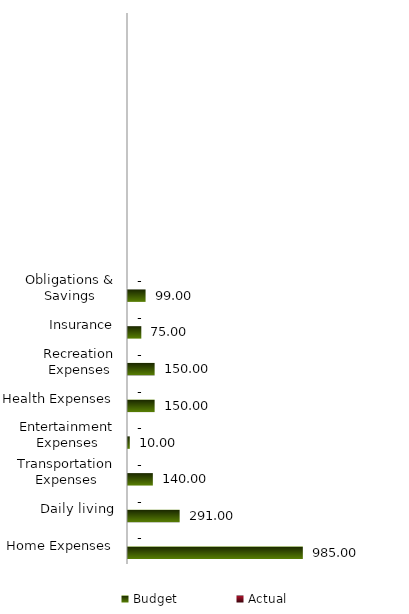
| Category | Budget | Actual |
|---|---|---|
| Home Expenses | 985 | 0 |
| Daily living | 291 | 0 |
| Transportation Expenses | 140 | 0 |
| Entertainment Expenses | 10 | 0 |
| Health Expenses | 150 | 0 |
| Recreation Expenses | 150 | 0 |
| Insurance | 75 | 0 |
| Obligations & Savings | 99 | 0 |